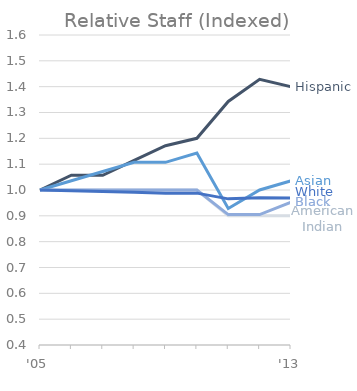
| Category | Series 0 | Series 1 | Series 2 | Series 3 | Series 4 |
|---|---|---|---|---|---|
| '05 | 1 | 1 | 1 | 1 | 1 |
|  | 1.057 | 1 | 1.036 | 1 | 0.997 |
|  | 1.057 | 1 | 1.071 | 1 | 0.994 |
|  | 1.114 | 1 | 1.107 | 1 | 0.991 |
|  | 1.171 | 1 | 1.107 | 1 | 0.988 |
|  | 1.2 | 1 | 1.143 | 1 | 0.988 |
|  | 1.343 | 0.9 | 0.929 | 0.905 | 0.966 |
|  | 1.429 | 0.9 | 1 | 0.905 | 0.97 |
| '13 | 1.4 | 0.9 | 1.036 | 0.952 | 0.969 |